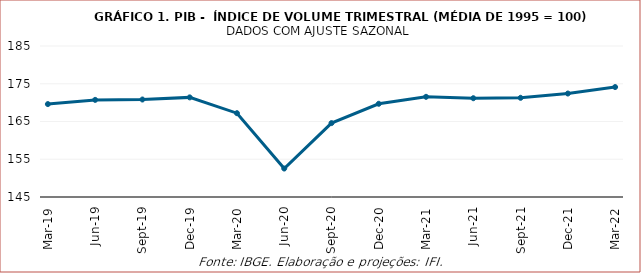
| Category | Índice de volume |
|---|---|
| 2019-03-01 | 169.614 |
| 2019-06-01 | 170.727 |
| 2019-09-01 | 170.824 |
| 2019-12-01 | 171.39 |
| 2020-03-01 | 167.203 |
| 2020-06-01 | 152.54 |
| 2020-09-01 | 164.579 |
| 2020-12-01 | 169.696 |
| 2021-03-01 | 171.538 |
| 2021-06-01 | 171.166 |
| 2021-09-01 | 171.275 |
| 2021-12-01 | 172.409 |
| 2022-03-01 | 174.127 |